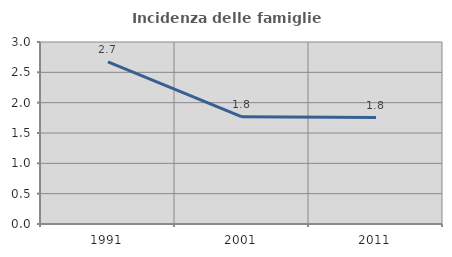
| Category | Incidenza delle famiglie numerose |
|---|---|
| 1991.0 | 2.672 |
| 2001.0 | 1.767 |
| 2011.0 | 1.754 |